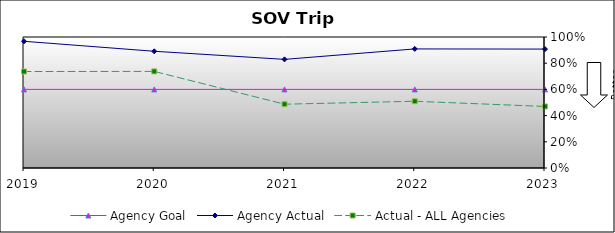
| Category | Agency Goal | Agency Actual | Actual - ALL Agencies |
|---|---|---|---|
| 2019.0 | 0.6 | 0.967 | 0.736 |
| 2020.0 | 0.6 | 0.891 | 0.737 |
| 2021.0 | 0.6 | 0.829 | 0.487 |
| 2022.0 | 0.6 | 0.909 | 0.509 |
| 2023.0 | 0.6 | 0.908 | 0.47 |